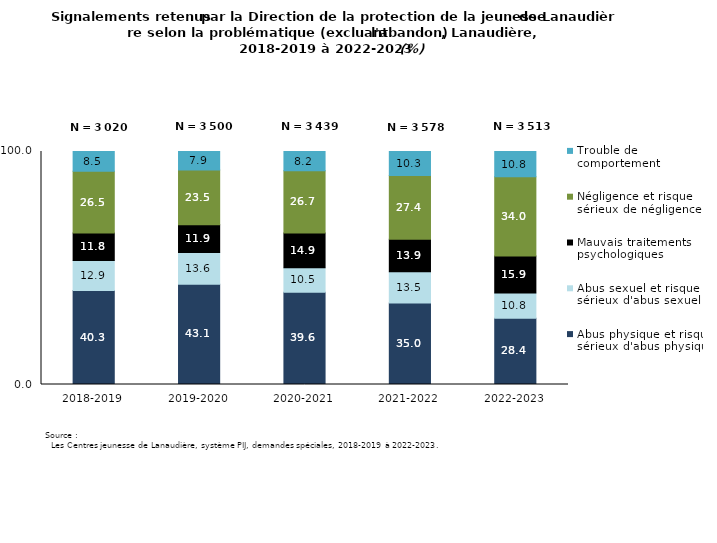
| Category | Abus physique et risque sérieux d'abus physique | Abus sexuel et risque sérieux d'abus sexuel | Mauvais traitements psychologiques | Négligence et risque sérieux de négligence | Trouble de comportement |
|---|---|---|---|---|---|
| 2018-2019 | 40.331 | 12.914 | 11.788 | 26.49 | 8.477 |
| 2019-2020 | 43.057 | 13.6 | 11.914 | 23.486 | 7.943 |
| 2020-2021 | 39.634 | 10.468 | 14.946 | 26.723 | 8.229 |
| 2021-2022 | 34.964 | 13.471 | 13.862 | 27.362 | 10.341 |
| 2022-2023 | 28.409 | 10.817 | 15.912 | 34.017 | 10.845 |